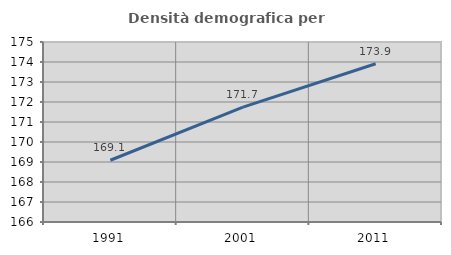
| Category | Densità demografica |
|---|---|
| 1991.0 | 169.088 |
| 2001.0 | 171.742 |
| 2011.0 | 173.911 |